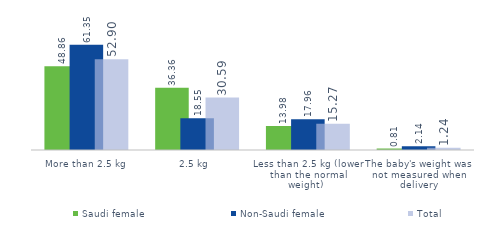
| Category | Saudi female  | Non-Saudi female | Total |
|---|---|---|---|
| More than 2.5 kg | 48.862 | 61.346 | 52.904 |
| 2.5 kg  | 36.356 | 18.549 | 30.59 |
| Less than 2.5 kg (lower than the normal weight)  | 13.975 | 17.962 | 15.266 |
| The baby's weight was not measured when delivery | 0.807 | 2.143 | 1.24 |